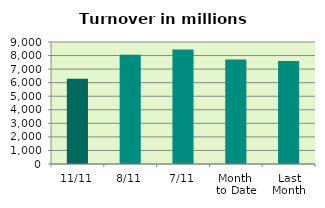
| Category | Series 0 |
|---|---|
| 11/11 | 6289.822 |
| 8/11 | 8067.613 |
| 7/11 | 8446.702 |
| Month 
to Date | 7713.346 |
| Last
Month | 7601.18 |